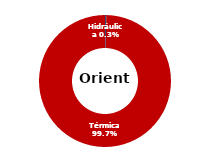
| Category | Oriente |
|---|---|
| Eólica | 0 |
| Hidráulica | 0.294 |
| Solar | 0 |
| Térmica | 92.811 |